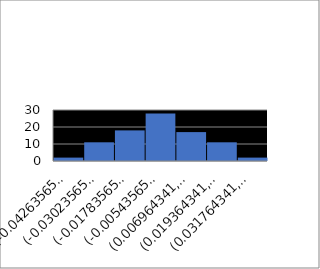
| Category | Series 0 |
|---|---|
| 0 | 0.468 |
| 1 | 0.513 |
| 2 | 0.467 |
| 3 | 0.474 |
| 4 | 0.486 |
| 5 | 0.395 |
| 6 | 0.427 |
| 7 | 0.396 |
| 8 | 0.339 |
| 9 | 0.236 |
| 10 | 0.274 |
| 11 | 0.268 |
| 12 | 0.251 |
| 13 | 0.26 |
| 14 | 0.247 |
| 15 | 0.274 |
| 16 | 0.175 |
| 17 | 0.059 |
| 18 | 0.062 |
| 19 | 0.098 |
| 20 | 0.135 |
| 21 | 0.167 |
| 22 | 0.232 |
| 23 | 0.302 |
| 24 | 0.203 |
| 25 | 0.08 |
| 26 | 0.102 |
| 27 | 0.063 |
| 28 | 0.065 |
| 29 | 0.185 |
| 30 | 0.141 |
| 31 | 0.163 |
| 32 | 0.172 |
| 33 | 0.157 |
| 34 | 0 |
| 35 | 0.006 |
| 36 | 0.054 |
| 37 | 0.035 |
| 38 | 0.13 |
| 39 | 0.105 |
| 40 | 0.239 |
| 41 | 0.337 |
| 42 | 0.377 |
| 43 | 0.396 |
| 44 | 0.384 |
| 45 | 0.383 |
| 46 | 0.42 |
| 47 | 0.403 |
| 48 | 0.342 |
| 49 | 0.333 |
| 50 | 0.455 |
| 51 | 0.47 |
| 52 | 0.532 |
| 53 | 0.493 |
| 54 | 0.44 |
| 55 | 0.486 |
| 56 | 0.491 |
| 57 | 0.491 |
| 58 | 0.291 |
| 59 | 0.145 |
| 60 | 0.132 |
| 61 | 0.234 |
| 62 | 0.196 |
| 63 | 0.139 |
| 64 | 0.22 |
| 65 | 0.267 |
| 66 | 0.294 |
| 67 | 0.442 |
| 68 | 0.567 |
| 69 | 0.683 |
| 70 | 0.657 |
| 71 | 0.694 |
| 72 | 0.687 |
| 73 | 0.624 |
| 74 | 0.606 |
| 75 | 0.59 |
| 76 | 0.495 |
| 77 | 0.483 |
| 78 | 0.38 |
| 79 | 0.358 |
| 80 | 0.315 |
| 81 | 0.278 |
| 82 | 0.227 |
| 83 | 0.256 |
| 84 | 0.16 |
| 85 | 0.095 |
| 86 | 0 |
| 87 | 0 |
| 88 | 0.05 |
| 89 | 0.226 |